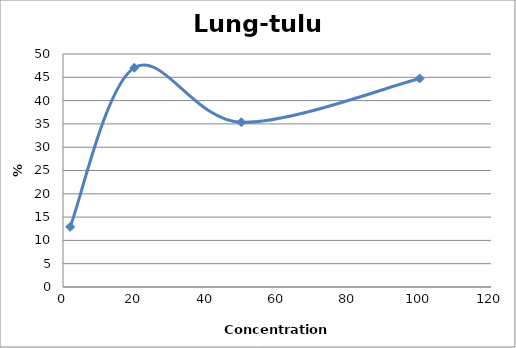
| Category | Lung-tulu4 |
|---|---|
| 100.0 | 44.74 |
| 50.0 | 35.346 |
| 20.0 | 47.061 |
| 2.0 | 12.901 |
| nan | 0 |
| nan | 0 |
| nan | 0 |
| nan | 0 |
| nan | 0 |